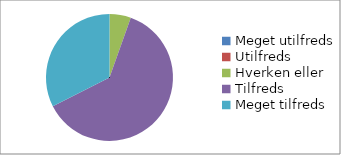
| Category | Hvor tilfreds er du med arrangementets praktiske afvikling - forplejningen? (n=38) |
|---|---|
| Meget utilfreds | 0 |
| Utilfreds | 0 |
| Hverken eller | 0.053 |
| Tilfreds | 0.605 |
| Meget tilfreds | 0.316 |